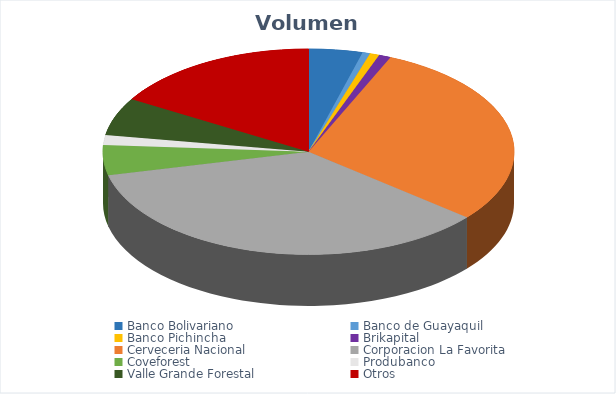
| Category | VOLUMEN ($USD) |
|---|---|
| Banco Bolivariano | 13500 |
| Banco de Guayaquil | 1880 |
| Banco Pichincha | 2400 |
| Brikapital | 3000 |
| Cerveceria Nacional | 94024 |
| Corporacion La Favorita | 112546.48 |
| Coveforest | 15002 |
| Produbanco | 4956.34 |
| Valle Grande Forestal | 18954 |
| Otros | 52500 |